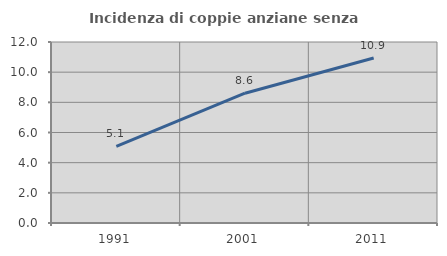
| Category | Incidenza di coppie anziane senza figli  |
|---|---|
| 1991.0 | 5.075 |
| 2001.0 | 8.606 |
| 2011.0 | 10.941 |